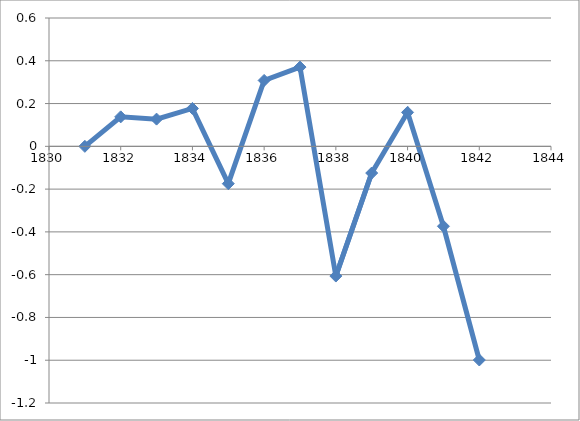
| Category | Series 0 |
|---|---|
| 1831.0 | 0 |
| 1832.0 | 0.138 |
| 1833.0 | 0.127 |
| 1834.0 | 0.177 |
| 1835.0 | -0.175 |
| 1836.0 | 0.308 |
| 1837.0 | 0.371 |
| 1838.0 | -0.606 |
| 1839.0 | -0.125 |
| 1840.0 | 0.159 |
| 1841.0 | -0.374 |
| 1842.0 | -0.999 |